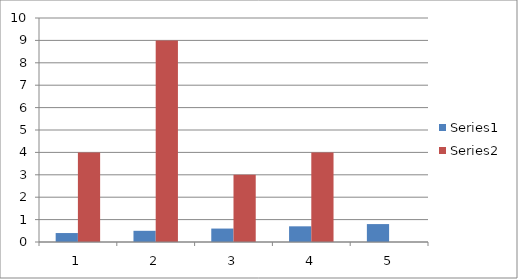
| Category | Series 0 | Series 1 |
|---|---|---|
| 0 | 0.4 | 4 |
| 1 | 0.5 | 9 |
| 2 | 0.6 | 3 |
| 3 | 0.7 | 4 |
| 4 | 0.8 | 0 |